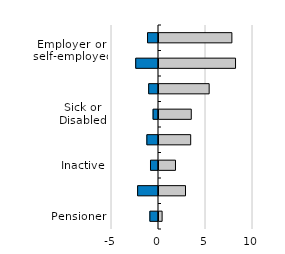
| Category | Taxes + contributions | Benefits |
|---|---|---|
| Pensioner | -0.917 | 0.438 |
| Employee | -2.22 | 2.926 |
| Inactive | -0.851 | 1.861 |
| Other | -1.238 | 3.478 |
| Sick or Disabled | -0.576 | 3.54 |
| Student | -1.044 | 5.442 |
| Employer or 
self-employed | -2.423 | 8.249 |
| Unemployed | -1.164 | 7.859 |